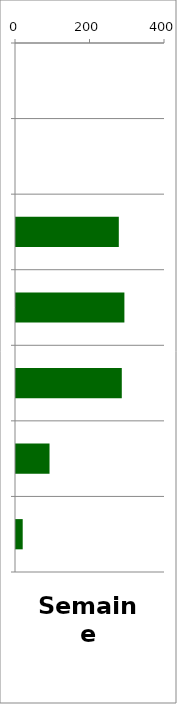
| Category | PL |
|---|---|
| 0 | 0 |
| 1 | 0 |
| 2 | 276 |
| 3 | 291 |
| 4 | 284 |
| 5 | 90 |
| 6 | 18 |